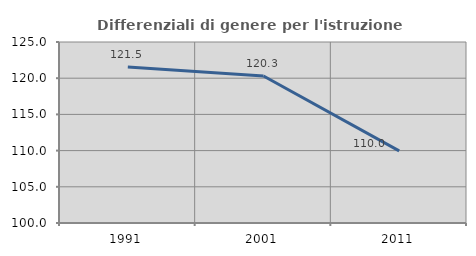
| Category | Differenziali di genere per l'istruzione superiore |
|---|---|
| 1991.0 | 121.53 |
| 2001.0 | 120.296 |
| 2011.0 | 109.96 |